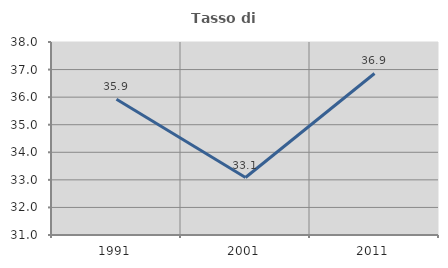
| Category | Tasso di occupazione   |
|---|---|
| 1991.0 | 35.924 |
| 2001.0 | 33.085 |
| 2011.0 | 36.858 |